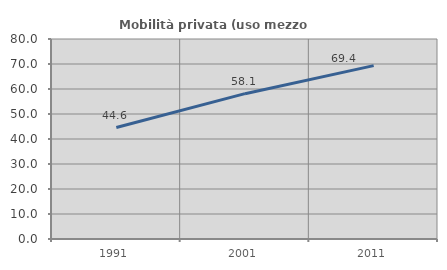
| Category | Mobilità privata (uso mezzo privato) |
|---|---|
| 1991.0 | 44.574 |
| 2001.0 | 58.13 |
| 2011.0 | 69.355 |